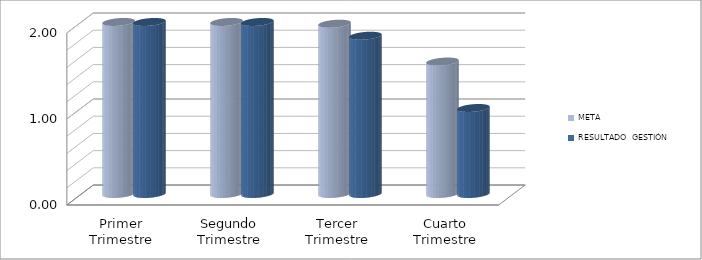
| Category | META | RESULTADO  GESTIÓN PERÍODO |
|---|---|---|
| Primer Trimestre | 2 | 2 |
| Segundo Trimestre | 2.48 | 2.48 |
| Tercer Trimestre | 1.98 | 1.84 |
| Cuarto Trimestre | 1.54 | 1 |